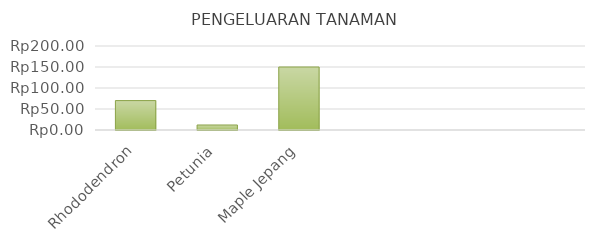
| Category | Rhododendron |
|---|---|
| Rhododendron | 70 |
| Petunia | 11.94 |
| Maple Jepang | 150 |